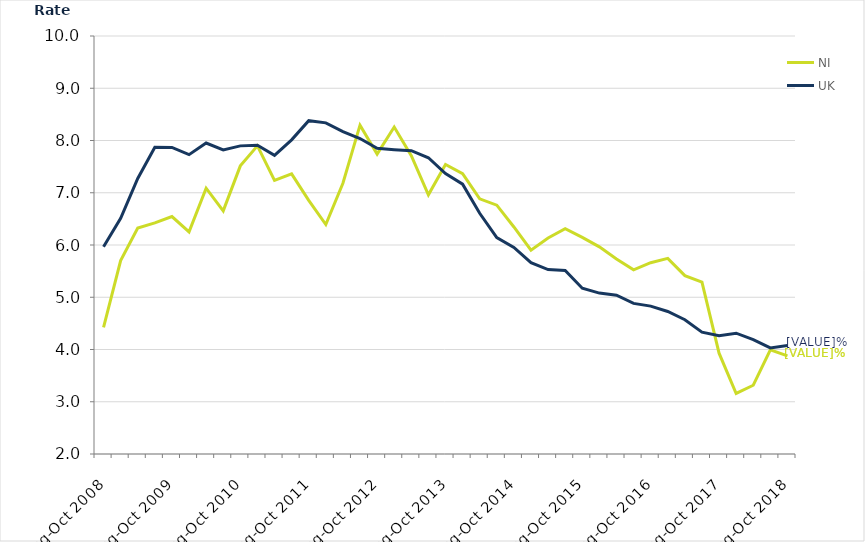
| Category | NI | UK |
|---|---|---|
| Aug-Oct 2008 | 4.424 | 5.968 |
| Nov-Jan 2009 | 5.7 | 6.511 |
| Feb-Apr 2009 | 6.323 | 7.274 |
| May-Jul 2009 | 6.424 | 7.868 |
| Aug-Oct 2009 | 6.545 | 7.868 |
| Nov-Jan 2010 | 6.251 | 7.729 |
| Feb-Apr 2010 | 7.087 | 7.952 |
| May-Jul 2010 | 6.654 | 7.82 |
| Aug-Oct 2010 | 7.514 | 7.897 |
| Nov-Jan 2011 | 7.898 | 7.909 |
| Feb-Apr 2011 | 7.236 | 7.717 |
| May-Jul 2011 | 7.361 | 8.013 |
| Aug-Oct 2011 | 6.855 | 8.38 |
| Nov-Jan 2012 | 6.392 | 8.338 |
| Feb-Apr 2012 | 7.181 | 8.17 |
| May-Jul 2012 | 8.293 | 8.037 |
| Aug-Oct 2012 | 7.739 | 7.851 |
| Nov-Jan 2013 | 8.257 | 7.825 |
| Feb-Apr 2013 | 7.709 | 7.805 |
| May-Jul 2013 | 6.961 | 7.67 |
| Aug-Oct 2013 | 7.542 | 7.366 |
| Nov-Jan 2014 | 7.365 | 7.165 |
| Feb-Apr 2014 | 6.883 | 6.607 |
| May-Jul 2014 | 6.763 | 6.141 |
| Aug-Oct 2014 | 6.345 | 5.952 |
| Nov-Jan 2015 | 5.901 | 5.662 |
| Feb-Apr 2015 | 6.135 | 5.53 |
| May-Jul 2015 | 6.313 | 5.512 |
| Aug-Oct 2015 | 6.146 | 5.172 |
| Nov-Jan 2016 | 5.965 | 5.08 |
| Feb-Apr 2016 | 5.732 | 5.038 |
| May-Jul 2016 | 5.525 | 4.882 |
| Aug-Oct 2016 | 5.661 | 4.83 |
| Nov-Jan 2017 | 5.744 | 4.728 |
| Feb-Apr 2017 | 5.415 | 4.571 |
| May-Jul 2017 | 5.291 | 4.333 |
| Aug-Oct 2017 | 3.93 | 4.265 |
| Nov-Jan 2018 | 3.158 | 4.313 |
| Feb-Apr 2018 | 3.316 | 4.188 |
| May-Jul 2018 | 3.992 | 4.03 |
| Aug-Oct 2018 | 3.877 | 4.076 |